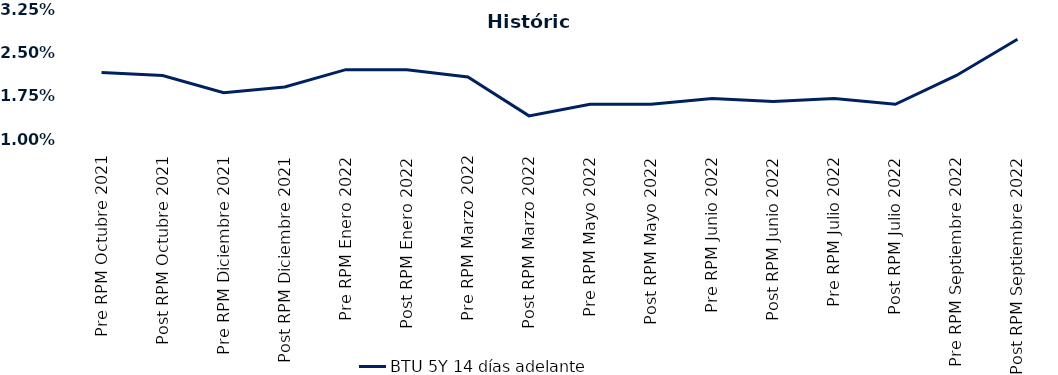
| Category | BTU 5Y 14 días adelante |
|---|---|
| Pre RPM Octubre 2021 | 0.022 |
| Post RPM Octubre 2021 | 0.021 |
| Pre RPM Diciembre 2021 | 0.018 |
| Post RPM Diciembre 2021 | 0.019 |
| Pre RPM Enero 2022 | 0.022 |
| Post RPM Enero 2022 | 0.022 |
| Pre RPM Marzo 2022 | 0.021 |
| Post RPM Marzo 2022 | 0.014 |
| Pre RPM Mayo 2022 | 0.016 |
| Post RPM Mayo 2022 | 0.016 |
| Pre RPM Junio 2022 | 0.017 |
| Post RPM Junio 2022 | 0.016 |
| Pre RPM Julio 2022 | 0.017 |
| Post RPM Julio 2022 | 0.016 |
| Pre RPM Septiembre 2022 | 0.021 |
| Post RPM Septiembre 2022 | 0.027 |